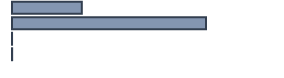
| Category | Series 0 |
|---|---|
| 0 | 26.446 |
| 1 | 73.485 |
| 2 | 0.017 |
| 3 | 0.052 |